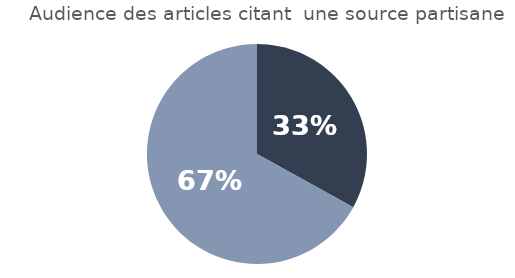
| Category | Series 0 |
|---|---|
| 0 | 0.33 |
| 1 | 0.67 |